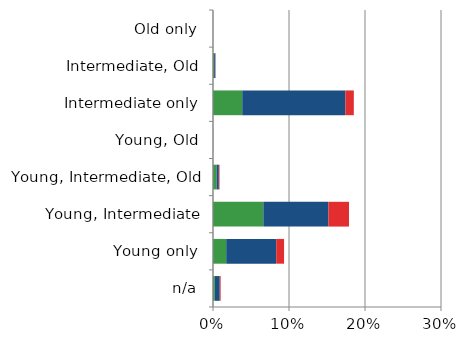
| Category | England | Scotland | Wales |
|---|---|---|---|
| n/a | 0.002 | 0.007 | 0.001 |
| Young only | 0.017 | 0.066 | 0.01 |
| Young, Intermediate | 0.066 | 0.086 | 0.027 |
| Young, Intermediate, Old | 0.005 | 0.003 | 0.001 |
| Young, Old | 0 | 0 | 0 |
| Intermediate only | 0.038 | 0.136 | 0.011 |
| Intermediate, Old | 0.002 | 0.002 | 0 |
| Old only | 0 | 0 | 0 |